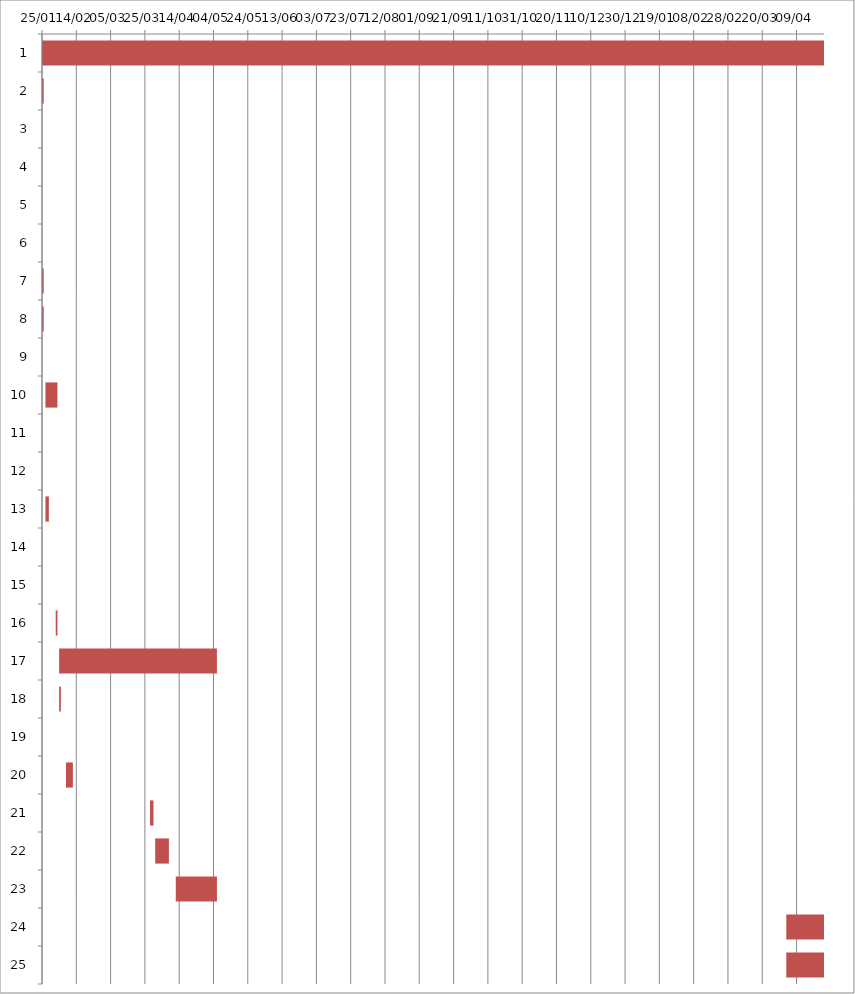
| Category | Fecha de inicio | DURACIÓN |
|---|---|---|
| 0 | 1/25/16 | 554 |
| 1 | 1/25/16 | 1 |
| 2 | 1/25/16 | 0 |
| 3 | 1/25/16 | 0 |
| 4 | 1/25/16 | 0 |
| 5 | 1/25/16 | 0 |
| 6 | 1/25/16 | 1 |
| 7 | 1/25/16 | 1 |
| 8 | 1/26/16 | 0 |
| 9 | 1/27/16 | 7 |
| 10 | 1/27/16 | 0 |
| 11 | 1/28/16 | 0 |
| 12 | 1/27/16 | 2 |
| 13 | 2/1/16 | 0 |
| 14 | 2/2/16 | 0 |
| 15 | 2/2/16 | 1 |
| 16 | 2/4/16 | 92 |
| 17 | 2/4/16 | 1 |
| 18 | 2/5/16 | 0 |
| 19 | 2/8/16 | 4 |
| 20 | 3/28/16 | 2 |
| 21 | 3/31/16 | 8 |
| 22 | 4/12/16 | 24 |
| 23 | 4/3/17 | 120 |
| 24 | 4/3/17 | 117 |